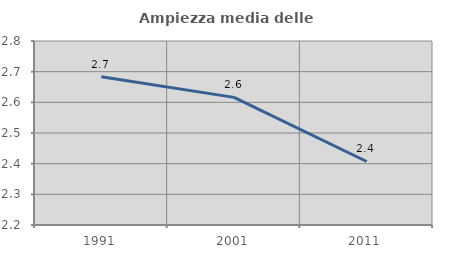
| Category | Ampiezza media delle famiglie |
|---|---|
| 1991.0 | 2.683 |
| 2001.0 | 2.616 |
| 2011.0 | 2.407 |